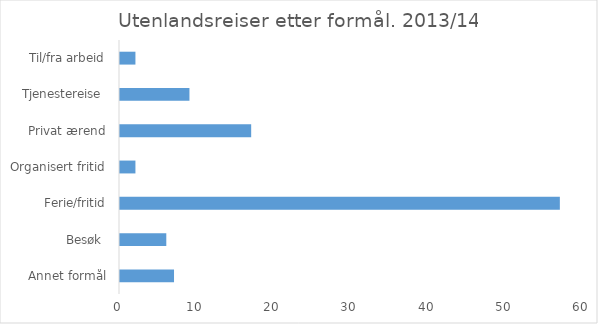
| Category | Series 0 |
|---|---|
| Annet formål | 7 |
| Besøk  | 6 |
| Ferie/fritid | 57 |
| Organisert fritid | 2 |
| Privat ærend | 17 |
| Tjenestereise  | 9 |
| Til/fra arbeid | 2 |